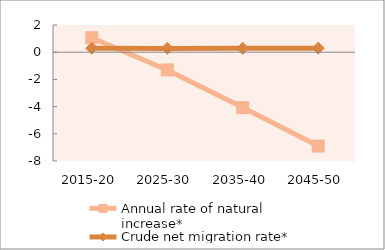
| Category | Annual rate of natural increase* | Crude net migration rate* |
|---|---|---|
| 2015-20 | 1.065 | 0.288 |
| 2025-30 | -1.303 | 0.281 |
| 2035-40 | -4.074 | 0.282 |
| 2045-50 | -6.9 | 0.292 |